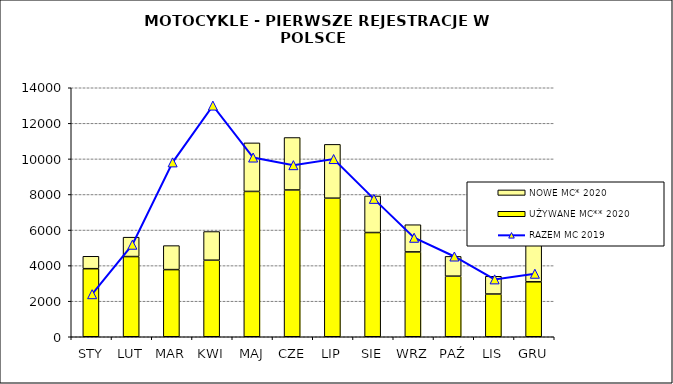
| Category | UŻYWANE MC** 2020 | NOWE MC* 2020 |
|---|---|---|
| STY | 3827 | 698 |
| LUT | 4509 | 1090 |
| MAR | 3775 | 1350 |
| KWI | 4303 | 1613 |
| MAJ | 8171 | 2729 |
| CZE | 8253 | 2949 |
| LIP | 7790 | 3027 |
| SIE | 5859 | 2057 |
| WRZ | 4771 | 1528 |
| PAŹ | 3406 | 1113 |
| LIS | 2402 | 999 |
| GRU | 3088 | 2662 |